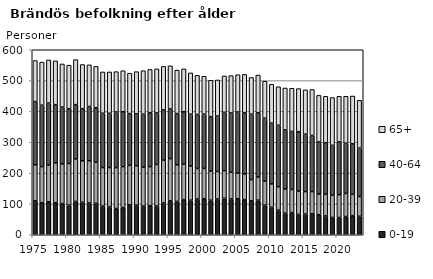
| Category | 0-19 | 20-39 | 40-64 | 65+ |
|---|---|---|---|---|
| 1975.0 | 110 | 117 | 205 | 133 |
| 1976.0 | 104 | 117 | 199 | 140 |
| 1977.0 | 107 | 119 | 201 | 140 |
| 1978.0 | 104 | 129 | 189 | 142 |
| 1979.0 | 101 | 129 | 184 | 140 |
| 1980.0 | 96 | 135 | 178 | 141 |
| 1981.0 | 108 | 138 | 176 | 146 |
| 1982.0 | 105 | 135 | 169 | 143 |
| 1983.0 | 103 | 137 | 176 | 135 |
| 1984.0 | 102 | 133 | 177 | 134 |
| 1985.0 | 93 | 125 | 176 | 134 |
| 1986.0 | 90 | 128 | 176 | 134 |
| 1987.0 | 85 | 133 | 180 | 131 |
| 1988.0 | 88 | 133 | 178 | 133 |
| 1989.0 | 97 | 128 | 168 | 131 |
| 1990.0 | 96 | 128 | 168 | 137 |
| 1991.0 | 93 | 126 | 172 | 141 |
| 1992.0 | 94 | 127 | 175 | 140 |
| 1993.0 | 93 | 135 | 167 | 143 |
| 1994.0 | 103 | 139 | 163 | 141 |
| 1995.0 | 110 | 137 | 161 | 140 |
| 1996.0 | 108 | 119 | 166 | 141 |
| 1997.0 | 114 | 115 | 170 | 139 |
| 1998.0 | 112 | 111 | 168 | 134 |
| 1999.0 | 116 | 99 | 175 | 127 |
| 2000.0 | 117 | 98 | 176 | 123 |
| 2001.0 | 112 | 94 | 177 | 118 |
| 2002.0 | 116 | 89 | 180 | 117 |
| 2003.0 | 118 | 90 | 189 | 118 |
| 2004.0 | 116 | 87 | 192 | 121 |
| 2005.0 | 117 | 83 | 198 | 121 |
| 2006.0 | 114 | 83 | 199 | 124 |
| 2007.0 | 110 | 69 | 212 | 119 |
| 2008.0 | 112 | 75 | 209 | 122 |
| 2009.0 | 96 | 78 | 204 | 120 |
| 2010.0 | 89 | 76 | 197 | 126 |
| 2011.0 | 80 | 76 | 199 | 125 |
| 2012.0 | 70 | 78 | 192 | 136 |
| 2013.0 | 72 | 75 | 188 | 140 |
| 2014.0 | 66 | 75 | 193 | 140 |
| 2015.0 | 67 | 73 | 186 | 144 |
| 2016.0 | 68 | 72 | 182 | 149 |
| 2017.0 | 65 | 67 | 169 | 151 |
| 2018.0 | 61 | 70 | 167 | 151 |
| 2019.0 | 56 | 72 | 162 | 155 |
| 2020.0 | 56 | 74 | 171 | 148 |
| 2021.0 | 59 | 75 | 163 | 152 |
| 2022.0 | 62 | 69 | 164 | 155 |
| 2023.0 | 60 | 64 | 157 | 155 |